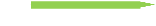
| Category | Helps in implementing change at the organization |
|---|---|
| Helps in implementing change at the organization | 4 |